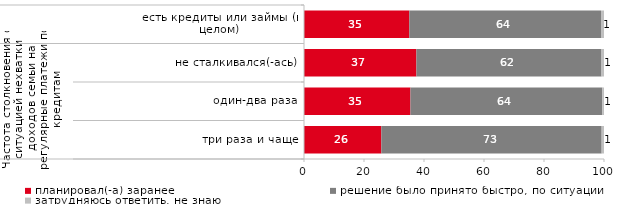
| Category | планировал(-а) заранее | решение было принято быстро, по ситуации | затрудняюсь ответить, не знаю |
|---|---|---|---|
| 0 | 35.118 | 63.885 | 0.996 |
| 1 | 37.474 | 61.698 | 0.828 |
| 2 | 35.484 | 63.978 | 0.538 |
| 3 | 25.781 | 73.438 | 0.781 |